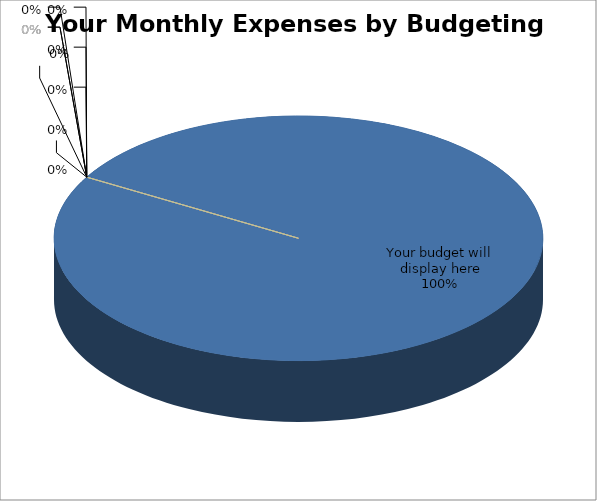
| Category | Series 0 |
|---|---|
| Your budget will display here | 1 |
|  | 0 |
|  | 0 |
|  | 0 |
|  | 0 |
|  | 0 |
|                                   | 0 |